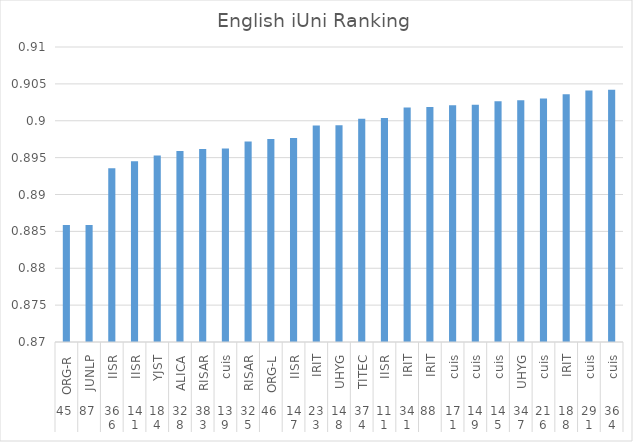
| Category | Series 0 |
|---|---|
| 0 | 0.886 |
| 1 | 0.886 |
| 2 | 0.894 |
| 3 | 0.895 |
| 4 | 0.895 |
| 5 | 0.896 |
| 6 | 0.896 |
| 7 | 0.896 |
| 8 | 0.897 |
| 9 | 0.898 |
| 10 | 0.898 |
| 11 | 0.899 |
| 12 | 0.899 |
| 13 | 0.9 |
| 14 | 0.9 |
| 15 | 0.902 |
| 16 | 0.902 |
| 17 | 0.902 |
| 18 | 0.902 |
| 19 | 0.903 |
| 20 | 0.903 |
| 21 | 0.903 |
| 22 | 0.904 |
| 23 | 0.904 |
| 24 | 0.904 |